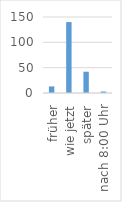
| Category | Series 0 |
|---|---|
| früher | 13 |
| wie jetzt | 140 |
| später | 42 |
| nach 8:00 Uhr | 3 |